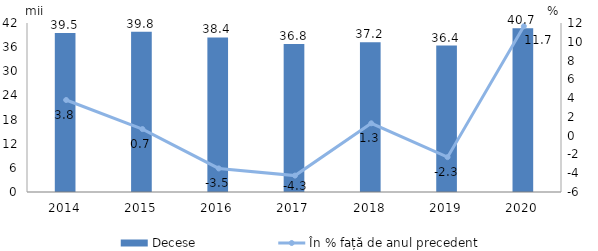
| Category | Decese |
|---|---|
| 2014.0 | 39.5 |
| 2015.0 | 39.8 |
| 2016.0 | 38.4 |
| 2017.0 | 36.8 |
| 2018.0 | 37.2 |
| 2019.0 | 36.4 |
| 2020.0 | 40.7 |